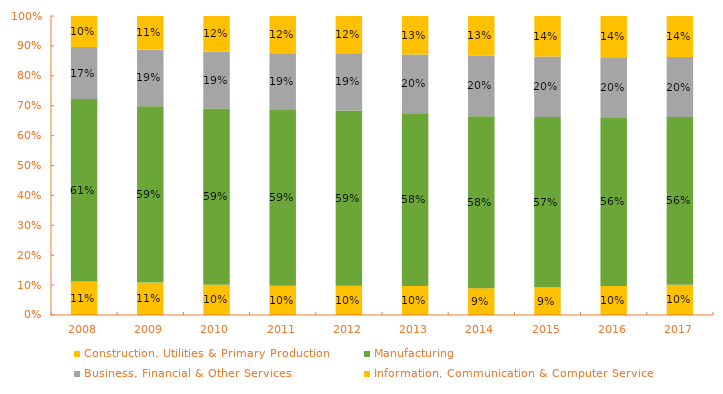
| Category | Construction, Utilities & Primary Production  | Manufacturing  | Business, Financial & Other Services | Information, Communication & Computer Services |
|---|---|---|---|---|
| 2008.0 | 0.112 | 0.61 | 0.174 | 0.104 |
| 2009.0 | 0.108 | 0.59 | 0.189 | 0.113 |
| 2010.0 | 0.101 | 0.589 | 0.191 | 0.119 |
| 2011.0 | 0.097 | 0.589 | 0.189 | 0.125 |
| 2012.0 | 0.098 | 0.586 | 0.191 | 0.125 |
| 2013.0 | 0.097 | 0.578 | 0.196 | 0.129 |
| 2014.0 | 0.09 | 0.575 | 0.203 | 0.132 |
| 2015.0 | 0.093 | 0.569 | 0.202 | 0.136 |
| 2016.0 | 0.097 | 0.562 | 0.203 | 0.138 |
| 2017.0 | 0.101 | 0.561 | 0.201 | 0.137 |